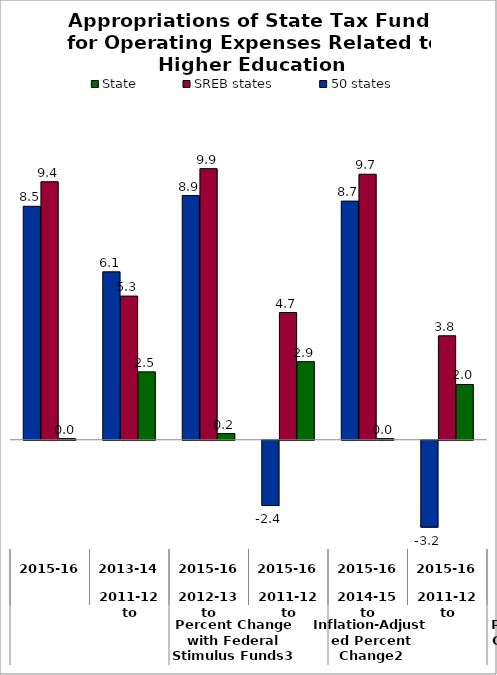
| Category | State | SREB states | 50 states |
|---|---|---|---|
| 0 | 2.024 | 3.807 | -3.181 |
| 1 | 0.042 | 9.722 | 8.737 |
| 2 | 2.86 | 4.657 | -2.388 |
| 3 | 0.228 | 9.926 | 8.94 |
| 4 | 2.485 | 5.261 | 6.148 |
| 5 | 0.042 | 9.448 | 8.547 |